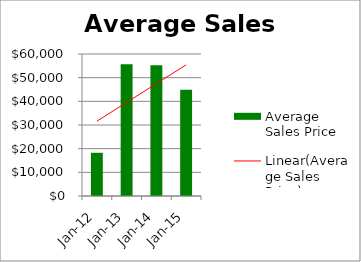
| Category | Average Sales Price |
|---|---|
| 2012-01-01 | 18256 |
| 2013-01-01 | 55682 |
| 2014-01-01 | 55268 |
| 2015-01-01 | 44852 |